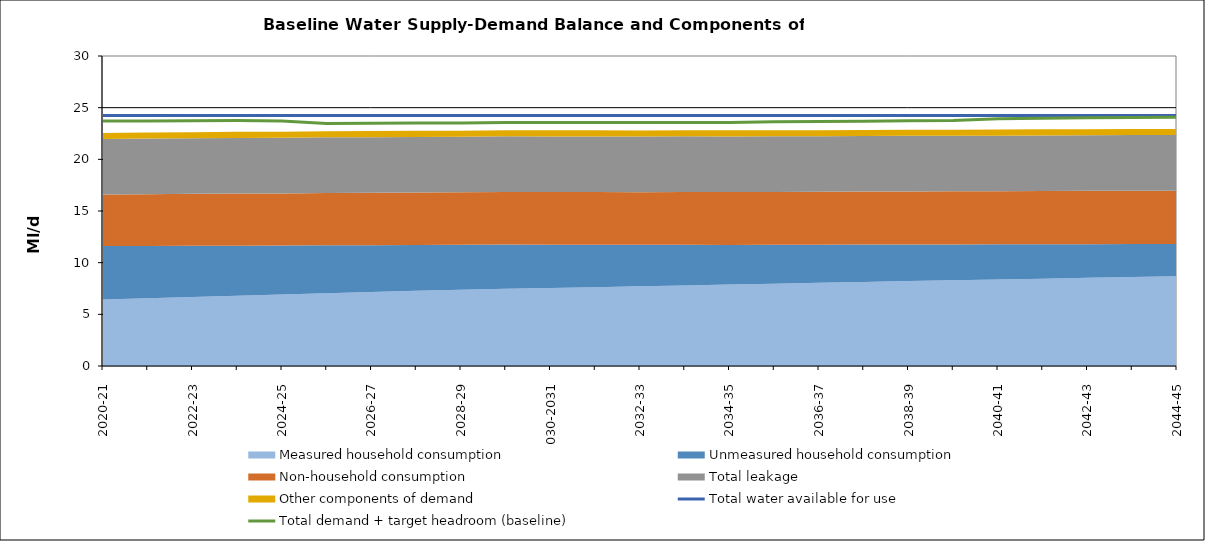
| Category | Total water available for use | Total demand + target headroom (baseline) |
|---|---|---|
| 0 | 24.24 | 23.706 |
| 1 | 24.24 | 23.703 |
| 2 | 24.24 | 23.742 |
| 3 | 24.24 | 23.754 |
| 4 | 24.24 | 23.721 |
| 5 | 24.24 | 23.472 |
| 6 | 24.24 | 23.484 |
| 7 | 24.24 | 23.504 |
| 8 | 24.24 | 23.511 |
| 9 | 24.24 | 23.566 |
| 10 | 24.24 | 23.568 |
| 11 | 24.24 | 23.564 |
| 12 | 24.24 | 23.568 |
| 13 | 24.24 | 23.565 |
| 14 | 24.24 | 23.572 |
| 15 | 24.24 | 23.633 |
| 16 | 24.24 | 23.67 |
| 17 | 24.24 | 23.679 |
| 18 | 24.24 | 23.73 |
| 19 | 24.24 | 23.755 |
| 20 | 24.24 | 23.93 |
| 21 | 24.24 | 23.988 |
| 22 | 24.24 | 24.021 |
| 23 | 24.24 | 24.047 |
| 24 | 24.24 | 24.084 |